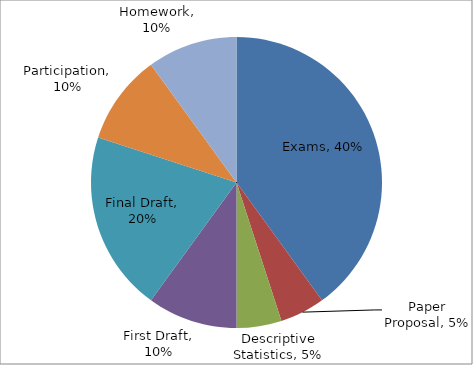
| Category | Series 0 |
|---|---|
| Exams | 0.4 |
| Paper Proposal | 0.05 |
| Descriptive Statistics | 0.05 |
| First Draft | 0.1 |
| Final Draft | 0.2 |
| Participation | 0.1 |
| Homework | 0.1 |